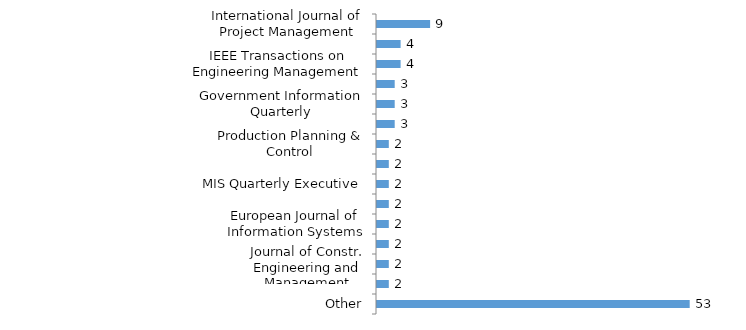
| Category | Series 0 |
|---|---|
| International Journal of Project Management | 9 |
| Project Management Journal | 4 |
| IEEE Transactions on Engineering Management | 4 |
| Technology Analysis & Strategic Management | 3 |
| Government Information Quarterly | 3 |
| The Journal of Systems and Software | 3 |
| Production Planning & Control | 2 |
| Procedia Computer Science | 2 |
| MIS Quarterly Executive | 2 |
| Information and Software Technology | 2 |
| European Journal of Information Systems | 2 |
| Journal of Management Studies | 2 |
| Journal of Constr. Engineering and Management | 2 |
| Information Systems Management | 2 |
| Other | 53 |